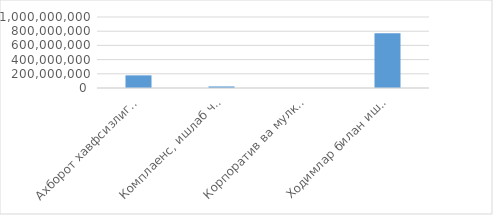
| Category | Товар / хизматнинг
жами суммаси
(cумда) 
(ҚҚС билан) |
|---|---|
| Ахборот хавфсизлиги ва ахборот технологияларини ривожлантириш бошқармаси | 177850000 |
| Комплаенс, ишлаб чикариш ва молиявий хавфларни мониторинг қилиш департаменти | 22000000 |
| Корпоратив ва мулкий муносабатлар бошқармаси | 0 |
| Ходимлар билан ишлаш бошқармаси | 770506200 |